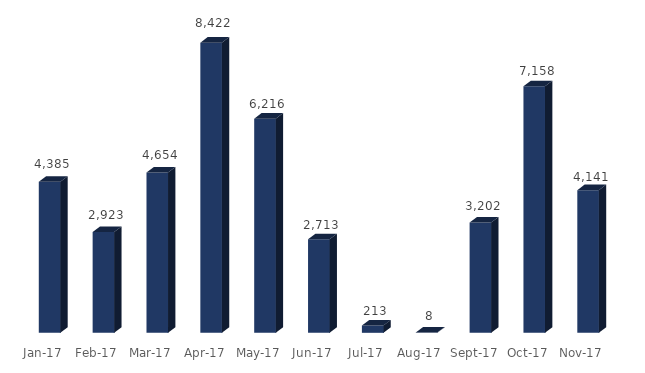
| Category | Series 0 |
|---|---|
| 2017-01-01 | 4385 |
| 2017-02-01 | 2923 |
| 2017-03-01 | 4654 |
| 2017-04-01 | 8422 |
| 2017-05-01 | 6216 |
| 2017-06-01 | 2713 |
| 2017-07-01 | 213 |
| 2017-08-01 | 8 |
| 2017-09-01 | 3202 |
| 2017-10-01 | 7158 |
| 2017-11-01 | 4141 |